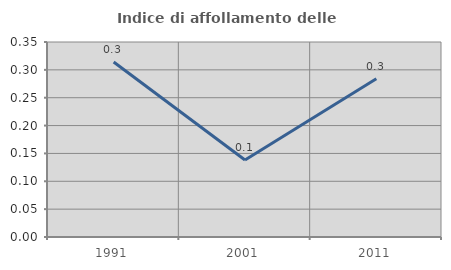
| Category | Indice di affollamento delle abitazioni  |
|---|---|
| 1991.0 | 0.314 |
| 2001.0 | 0.138 |
| 2011.0 | 0.284 |